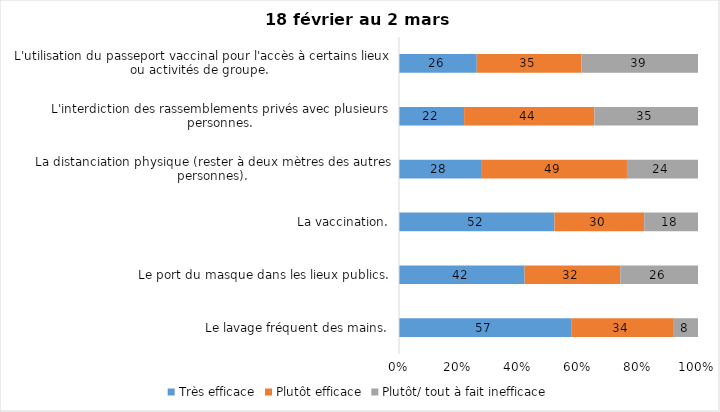
| Category | Très efficace | Plutôt efficace | Plutôt/ tout à fait inefficace |
|---|---|---|---|
| Le lavage fréquent des mains. | 57 | 34 | 8 |
| Le port du masque dans les lieux publics. | 42 | 32 | 26 |
| La vaccination. | 52 | 30 | 18 |
| La distanciation physique (rester à deux mètres des autres personnes). | 28 | 49 | 24 |
| L'interdiction des rassemblements privés avec plusieurs personnes. | 22 | 44 | 35 |
| L'utilisation du passeport vaccinal pour l'accès à certains lieux ou activités de groupe.  | 26 | 35 | 39 |